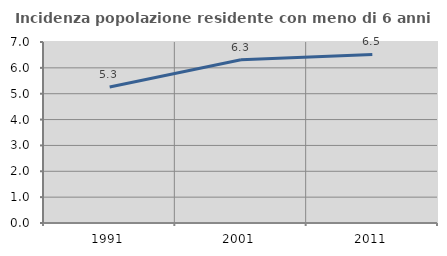
| Category | Incidenza popolazione residente con meno di 6 anni |
|---|---|
| 1991.0 | 5.259 |
| 2001.0 | 6.315 |
| 2011.0 | 6.519 |